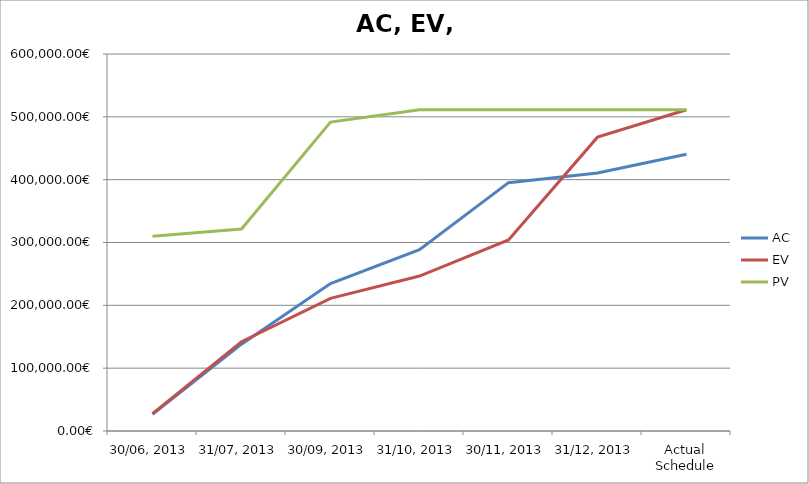
| Category | AC | EV | PV |
|---|---|---|---|
| 30/06, 2013 | 26568.125 | 27738.272 | 309979.348 |
| 31/07, 2013 | 138211.117 | 142153.761 | 321361.348 |
| 30/09, 2013 | 234732.328 | 211186.974 | 491658.345 |
| 31/10, 2013 | 288477.417 | 246584.513 | 511325.86 |
| 30/11, 2013 | 395246.772 | 304066.601 | 511325.86 |
| 31/12, 2013 | 410601.819 | 467652.51 | 511325.86 |
| Actual Schedule | 440394.16 | 511325.86 | 511325.86 |